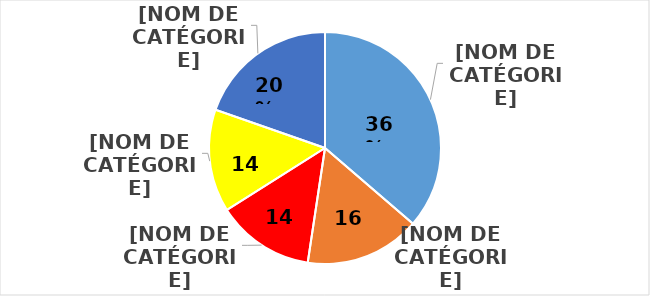
| Category | Fréquence des arnaques les plus courantes |
|---|---|
| Produit ou service non fourni ou non livré | 0.362 |
| Qualités ou quantités non conformes | 0.16 |
| Chantage, piège, fausse demande d'aide, fausse romance ou extorsion | 0.136 |
| Coût supplémentaire imprévu | 0.143 |
| Autres | 0.196 |